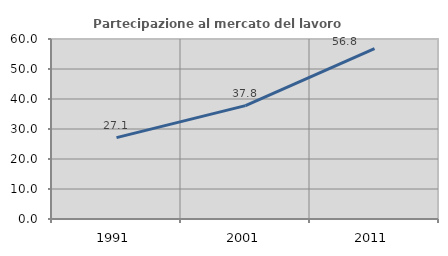
| Category | Partecipazione al mercato del lavoro  femminile |
|---|---|
| 1991.0 | 27.111 |
| 2001.0 | 37.795 |
| 2011.0 | 56.757 |